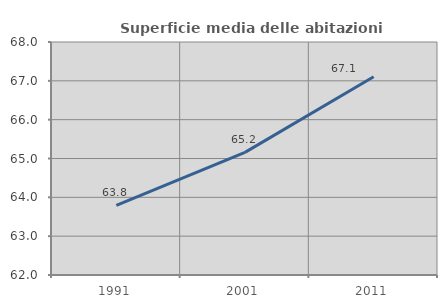
| Category | Superficie media delle abitazioni occupate |
|---|---|
| 1991.0 | 63.792 |
| 2001.0 | 65.158 |
| 2011.0 | 67.105 |